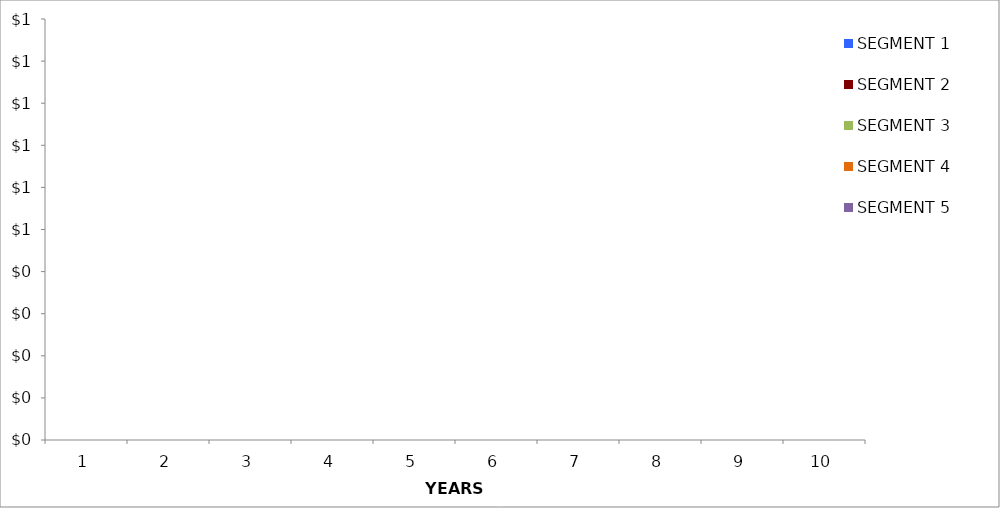
| Category | SEGMENT 1 | SEGMENT 2 | SEGMENT 3 | SEGMENT 4 | SEGMENT 5 |
|---|---|---|---|---|---|
| 0 | 0 | 0 | 0 | 0 | 0 |
| 1 | 0 | 0 | 0 | 0 | 0 |
| 2 | 0 | 0 | 0 | 0 | 0 |
| 3 | 0 | 0 | 0 | 0 | 0 |
| 4 | 0 | 0 | 0 | 0 | 0 |
| 5 | 0 | 0 | 0 | 0 | 0 |
| 6 | 0 | 0 | 0 | 0 | 0 |
| 7 | 0 | 0 | 0 | 0 | 0 |
| 8 | 0 | 0 | 0 | 0 | 0 |
| 9 | 0 | 0 | 0 | 0 | 0 |